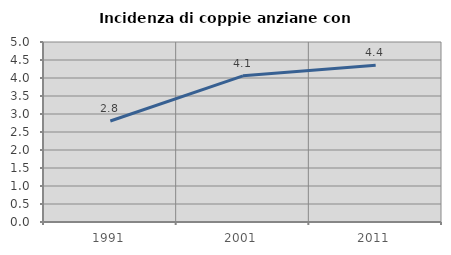
| Category | Incidenza di coppie anziane con figli |
|---|---|
| 1991.0 | 2.805 |
| 2001.0 | 4.06 |
| 2011.0 | 4.354 |